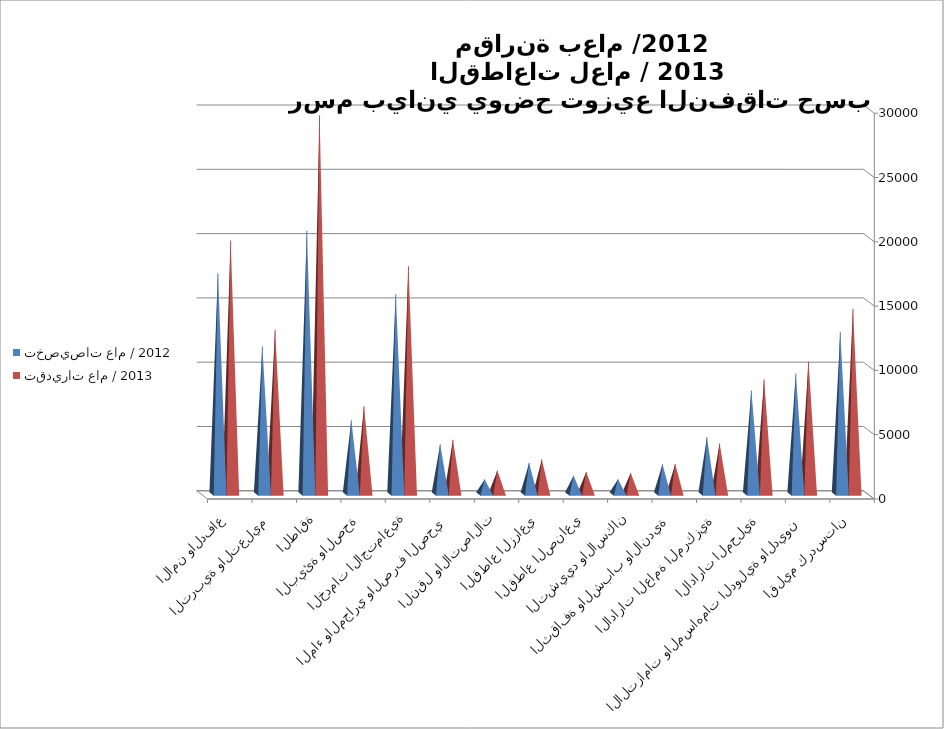
| Category | تخصيصات عام / 2012 | تقديرات عام / 2013  |
|---|---|---|
| الامن والدفاع | 17171.802 | 19702.296 |
| التربية والتعليم | 11476.225 | 12782.897 |
| الطاقة | 20460.595 | 29456.011 |
| البيئة والصحة | 5740.234 | 6825.231 |
| الخدمات الاجتماعية | 15544.085 | 17708.644 |
| الماء والمجاري والصرف الصحي | 3869.674 | 4214.134 |
| النقل والاتصالات | 1133.553 | 1825.767 |
| القطاع الزراعي | 2408.56 | 2684.995 |
| القطاع الصناعي | 1419.618 | 1714.323 |
| التشييد والاسكان | 1142 | 1636.842 |
| الثقافة والشباب والاندية | 2319.789 | 2327.115 |
| الادارات العامة المركزية | 4414.817 | 3932.51 |
| الادارات المحلية | 8048.781 | 8915.05 |
| الالتزامات والمساهمات الدولية والديون | 9368.246 | 10292.058 |
| اقليم كردستان | 12604.951 | 14406.735 |